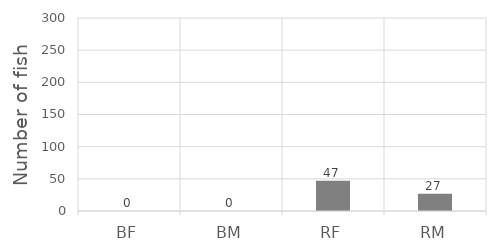
| Category | Series 0 |
|---|---|
| BF | 0 |
| BM | 0 |
| RF | 47 |
| RM | 27 |